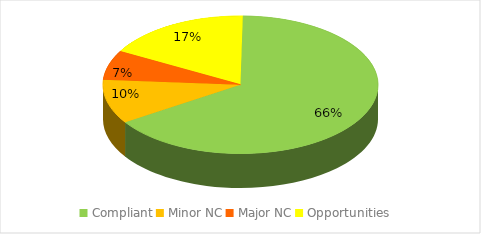
| Category | Series 0 |
|---|---|
| Compliant | 19 |
| Minor NC | 3 |
| Major NC | 2 |
| Opportunities | 5 |